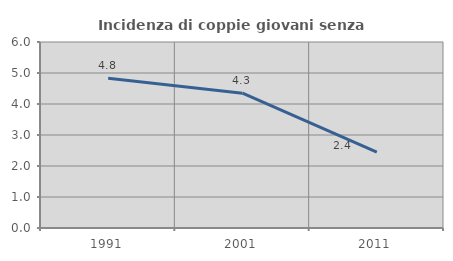
| Category | Incidenza di coppie giovani senza figli |
|---|---|
| 1991.0 | 4.829 |
| 2001.0 | 4.348 |
| 2011.0 | 2.444 |